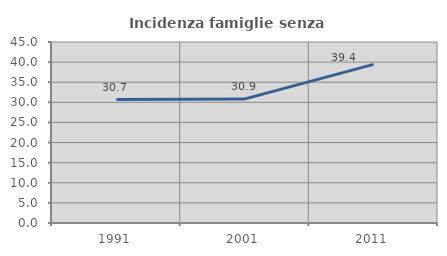
| Category | Incidenza famiglie senza nuclei |
|---|---|
| 1991.0 | 30.683 |
| 2001.0 | 30.851 |
| 2011.0 | 39.428 |